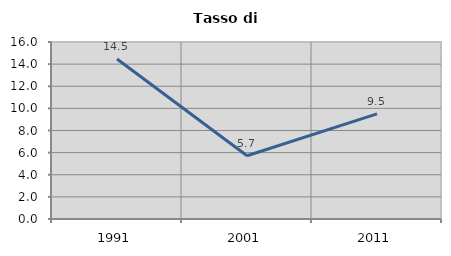
| Category | Tasso di disoccupazione   |
|---|---|
| 1991.0 | 14.465 |
| 2001.0 | 5.714 |
| 2011.0 | 9.5 |